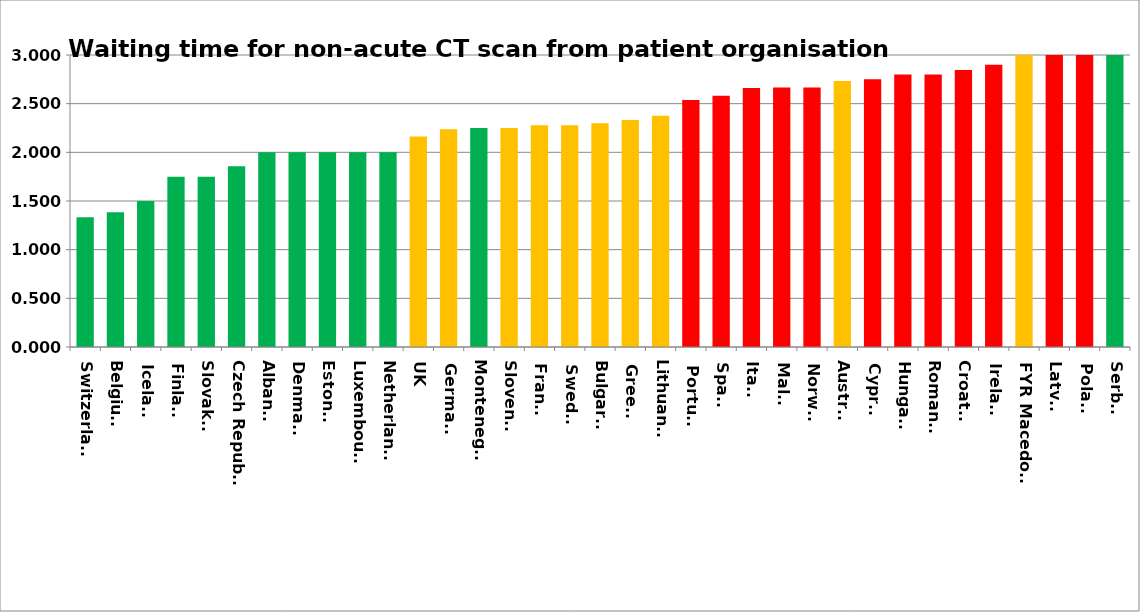
| Category | Series 0 |
|---|---|
| Switzerland | 1.333 |
| Belgium | 1.385 |
| Iceland | 1.5 |
| Finland | 1.75 |
| Slovakia | 1.75 |
| Czech Republic | 1.857 |
| Albania | 2 |
| Denmark | 2 |
| Estonia | 2 |
| Luxembourg | 2 |
| Netherlands | 2 |
| UK | 2.164 |
| Germany | 2.236 |
| Montenegro | 2.25 |
| Slovenia | 2.25 |
| France | 2.278 |
| Sweden | 2.278 |
| Bulgaria | 2.3 |
| Greece | 2.333 |
| Lithuania | 2.375 |
| Portugal | 2.538 |
| Spain | 2.581 |
| Italy | 2.662 |
| Malta | 2.667 |
| Norway | 2.667 |
| Austria | 2.733 |
| Cyprus | 2.75 |
| Hungary | 2.8 |
| Romania | 2.8 |
| Croatia | 2.846 |
| Ireland | 2.9 |
| FYR Macedonia | 3 |
| Latvia | 3 |
| Poland | 3 |
| Serbia | 3 |